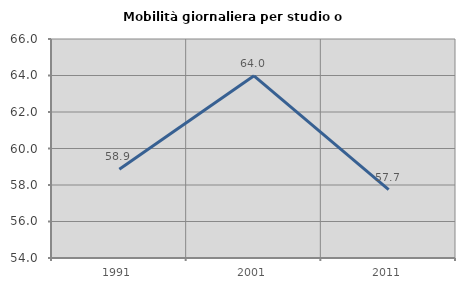
| Category | Mobilità giornaliera per studio o lavoro |
|---|---|
| 1991.0 | 58.868 |
| 2001.0 | 63.985 |
| 2011.0 | 57.746 |